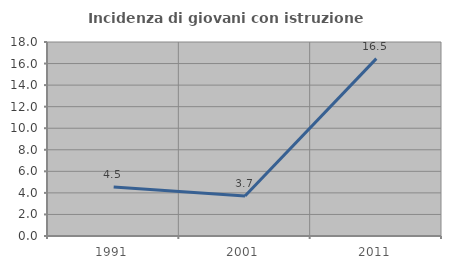
| Category | Incidenza di giovani con istruzione universitaria |
|---|---|
| 1991.0 | 4.545 |
| 2001.0 | 3.704 |
| 2011.0 | 16.456 |